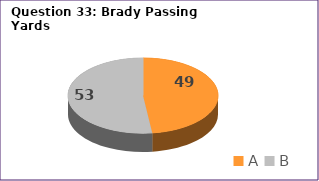
| Category | Series 0 |
|---|---|
| A | 49 |
| B | 53 |